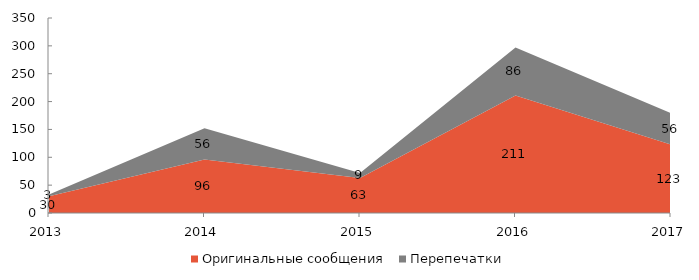
| Category | Оригинальные сообщения | Перепечатки |
|---|---|---|
| 2013 | 30 | 3 |
| 2014 | 96 | 56 |
| 2015 | 63 | 9 |
| 2016 | 211 | 86 |
| 2017 | 123 | 56 |